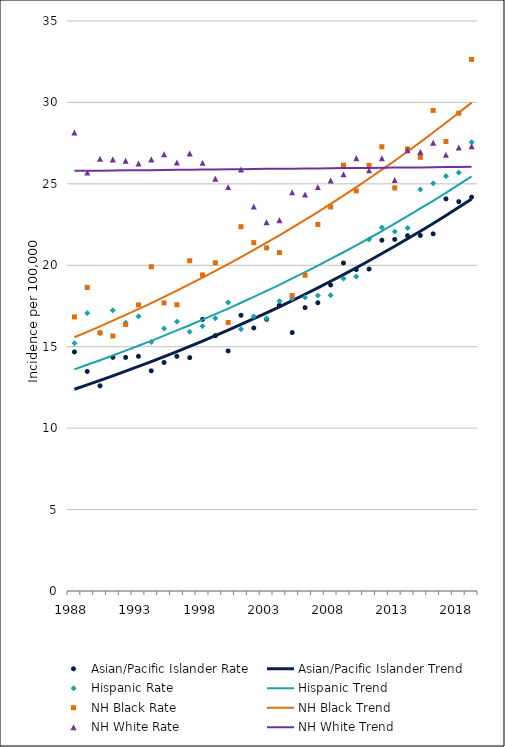
| Category | Asian/Pacific Islander Rate | Asian/Pacific Islander Trend | Hispanic Rate | Hispanic Trend | NH Black Rate | NH Black Trend | NH White Rate | NH White Trend |
|---|---|---|---|---|---|---|---|---|
| 1988.0 | 14.68 | 12.39 | 15.22 | 13.61 | 16.83 | 15.58 | 28.15 | 25.8 |
| 1989.0 | 13.48 | 12.66 | 17.06 | 13.89 | 18.64 | 15.91 | 25.7 | 25.8 |
| 1990.0 | 12.6 | 12.93 | 15.84 | 14.17 | 15.85 | 16.25 | 26.54 | 25.81 |
| 1991.0 | 14.35 | 13.21 | 17.23 | 14.46 | 15.66 | 16.6 | 26.5 | 25.82 |
| 1992.0 | 14.34 | 13.5 | 16.47 | 14.76 | 16.36 | 16.95 | 26.42 | 25.83 |
| 1993.0 | 14.41 | 13.79 | 16.86 | 15.06 | 17.57 | 17.31 | 26.25 | 25.84 |
| 1994.0 | 13.52 | 14.09 | 15.29 | 15.36 | 19.91 | 17.68 | 26.5 | 25.84 |
| 1995.0 | 14.03 | 14.39 | 16.12 | 15.68 | 17.69 | 18.06 | 26.82 | 25.85 |
| 1996.0 | 14.41 | 14.7 | 16.54 | 16 | 17.58 | 18.45 | 26.31 | 25.86 |
| 1997.0 | 14.33 | 15.02 | 15.92 | 16.32 | 20.28 | 18.84 | 26.87 | 25.87 |
| 1998.0 | 16.68 | 15.35 | 16.26 | 16.66 | 19.41 | 19.24 | 26.29 | 25.88 |
| 1999.0 | 15.68 | 15.68 | 16.75 | 17 | 20.15 | 19.65 | 25.32 | 25.88 |
| 2000.0 | 14.74 | 16.02 | 17.72 | 17.34 | 16.49 | 20.07 | 24.8 | 25.89 |
| 2001.0 | 16.93 | 16.37 | 16.08 | 17.7 | 22.37 | 20.5 | 25.88 | 25.9 |
| 2002.0 | 16.15 | 16.72 | 16.86 | 18.06 | 21.39 | 20.94 | 23.61 | 25.91 |
| 2003.0 | 16.68 | 17.08 | 16.74 | 18.43 | 21.07 | 21.39 | 22.65 | 25.92 |
| 2004.0 | 17.54 | 17.45 | 17.8 | 18.8 | 20.78 | 21.84 | 22.77 | 25.93 |
| 2005.0 | 15.87 | 17.83 | 17.96 | 19.19 | 18.14 | 22.31 | 24.48 | 25.93 |
| 2006.0 | 17.4 | 18.22 | 18.03 | 19.58 | 19.39 | 22.79 | 24.35 | 25.94 |
| 2007.0 | 17.7 | 18.61 | 18.14 | 19.98 | 22.51 | 23.27 | 24.8 | 25.95 |
| 2008.0 | 18.79 | 19.02 | 18.16 | 20.39 | 23.58 | 23.77 | 25.21 | 25.96 |
| 2009.0 | 20.14 | 19.43 | 19.18 | 20.8 | 26.15 | 24.28 | 25.59 | 25.97 |
| 2010.0 | 19.74 | 19.85 | 19.3 | 21.23 | 24.57 | 24.8 | 26.58 | 25.97 |
| 2011.0 | 19.77 | 20.28 | 21.59 | 21.66 | 26.14 | 25.33 | 25.83 | 25.98 |
| 2012.0 | 21.54 | 20.72 | 22.32 | 22.1 | 27.28 | 25.87 | 26.57 | 25.99 |
| 2013.0 | 21.59 | 21.17 | 22.07 | 22.56 | 24.75 | 26.42 | 25.23 | 26 |
| 2014.0 | 21.82 | 21.63 | 22.29 | 23.02 | 27.14 | 26.99 | 27.06 | 26.01 |
| 2015.0 | 21.83 | 22.09 | 24.65 | 23.49 | 26.63 | 27.56 | 26.96 | 26.01 |
| 2016.0 | 21.93 | 22.57 | 25.03 | 23.96 | 29.51 | 28.15 | 27.53 | 26.02 |
| 2017.0 | 24.08 | 23.06 | 25.47 | 24.45 | 27.6 | 28.75 | 26.78 | 26.03 |
| 2018.0 | 23.91 | 23.56 | 25.69 | 24.95 | 29.34 | 29.37 | 27.23 | 26.04 |
| 2019.0 | 24.18 | 24.07 | 27.56 | 25.46 | 32.64 | 29.99 | 27.31 | 26.05 |